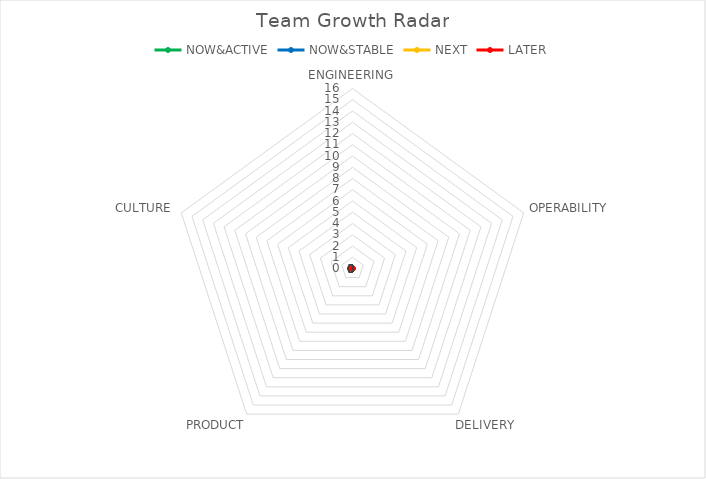
| Category | NOW&ACTIVE | NOW&STABLE | NEXT | LATER |
|---|---|---|---|---|
| ENGINEERING | 0 | 0 | 0 | 0 |
| OPERABILITY | 0 | 0 | 0 | 0 |
| DELIVERY | 0 | 0 | 0 | 0 |
| PRODUCT | 0 | 0 | 0 | 0 |
| CULTURE | 0 | 0 | 0 | 0 |